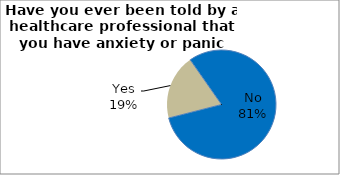
| Category | Series 0 |
|---|---|
| No | 80.728 |
| Yes | 19.272 |